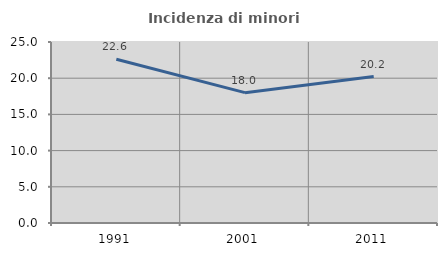
| Category | Incidenza di minori stranieri |
|---|---|
| 1991.0 | 22.628 |
| 2001.0 | 18.004 |
| 2011.0 | 20.232 |